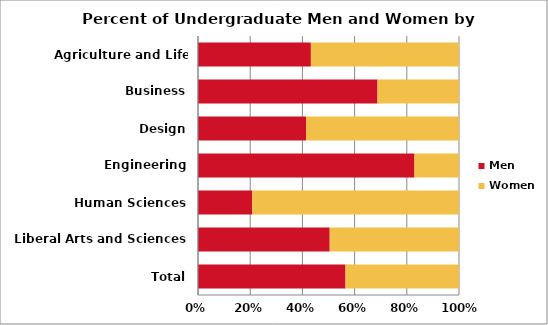
| Category | Men | Women |
|---|---|---|
| Agriculture and Life Sciences | 1710 | 2244 |
| Business | 2963 | 1345 |
| Design | 723 | 1023 |
| Engineering | 5830 | 1199 |
| Human Sciences | 705 | 2682 |
| Liberal Arts and Sciences | 3241 | 3181 |
| Total | 15172 | 11674 |